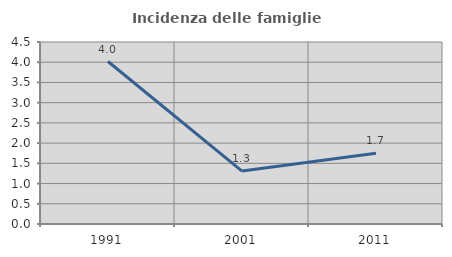
| Category | Incidenza delle famiglie numerose |
|---|---|
| 1991.0 | 4.017 |
| 2001.0 | 1.31 |
| 2011.0 | 1.75 |